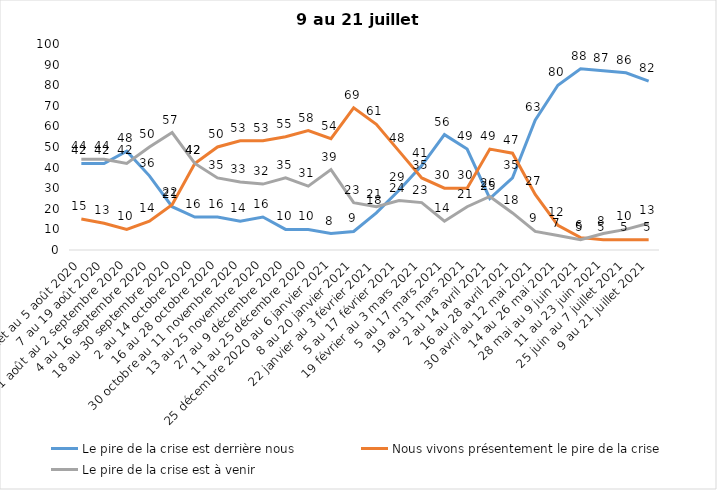
| Category | Le pire de la crise est derrière nous | Nous vivons présentement le pire de la crise | Le pire de la crise est à venir |
|---|---|---|---|
| 24 juillet au 5 août 2020 | 42 | 15 | 44 |
| 7 au 19 août 2020 | 42 | 13 | 44 |
| 21 août au 2 septembre 2020 | 48 | 10 | 42 |
| 4 au 16 septembre 2020 | 36 | 14 | 50 |
| 18 au 30 septembre 2020 | 21 | 22 | 57 |
| 2 au 14 octobre 2020 | 16 | 42 | 42 |
| 16 au 28 octobre 2020 | 16 | 50 | 35 |
| 30 octobre au 11 novembre 2020 | 14 | 53 | 33 |
| 13 au 25 novembre 2020 | 16 | 53 | 32 |
| 27 au 9 décembre 2020 | 10 | 55 | 35 |
| 11 au 25 décembre 2020 | 10 | 58 | 31 |
| 25 décembre 2020 au 6 janvier 2021 | 8 | 54 | 39 |
| 8 au 20 janvier 2021 | 9 | 69 | 23 |
| 22 janvier au 3 février 2021 | 18 | 61 | 21 |
| 5 au 17 février 2021 | 29 | 48 | 24 |
| 19 février au 3 mars 2021 | 41 | 35 | 23 |
| 5 au 17 mars 2021 | 56 | 30 | 14 |
| 19 au 31 mars 2021 | 49 | 30 | 21 |
| 2 au 14 avril 2021 | 25 | 49 | 26 |
| 16 au 28 avril 2021 | 35 | 47 | 18 |
| 30 avril au 12 mai 2021 | 63 | 27 | 9 |
| 14 au 26 mai 2021 | 80 | 12 | 7 |
| 28 mai au 9 juin 2021 | 88 | 6 | 5 |
| 11 au 23 juin 2021 | 87 | 5 | 8 |
| 25 juin au 7 juillet 2021 | 86 | 5 | 10 |
| 9 au 21 juillet 2021 | 82 | 5 | 13 |